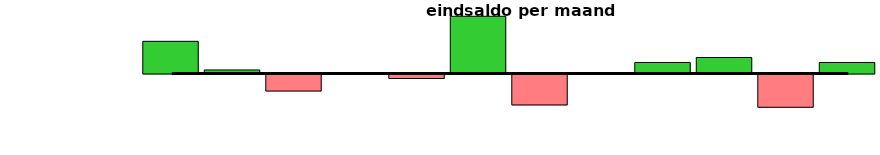
| Category | Series 0 |
|---|---|
|  | 2789 |
|  | -3436 |
| jan | 1965.5 |
| feb | 216.5 |
| mrt | -1041 |
| apr | -26 |
| mei | -274.5 |
| juni | 3493.5 |
| juli | -1889.5 |
| aug | -12.5 |
| sept | 672.5 |
| okt | 977.5 |
| nov | -2032.5 |
| dec | 672.5 |